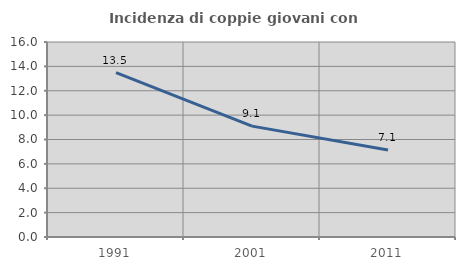
| Category | Incidenza di coppie giovani con figli |
|---|---|
| 1991.0 | 13.494 |
| 2001.0 | 9.098 |
| 2011.0 | 7.132 |